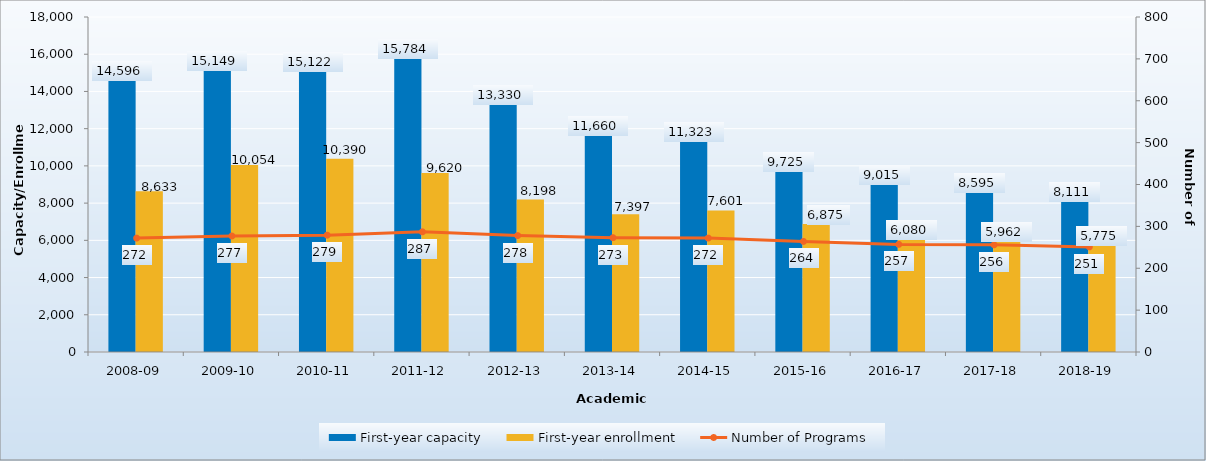
| Category | First-year capacity | First-year enrollment |
|---|---|---|
| 2008-09 | 14596 | 8633 |
| 2009-10 | 15149 | 10054 |
| 2010-11 | 15122 | 10390 |
| 2011-12 | 15784 | 9620 |
| 2012-13 | 13330 | 8198 |
| 2013-14 | 11660 | 7397 |
| 2014-15 | 11323 | 7601 |
| 2015-16 | 9725 | 6875 |
| 2016-17 | 9015 | 6080 |
| 2017-18 | 8595 | 5962 |
| 2018-19 | 8111 | 5775 |